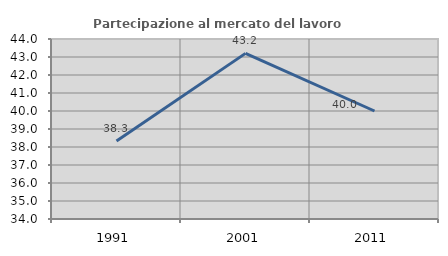
| Category | Partecipazione al mercato del lavoro  femminile |
|---|---|
| 1991.0 | 38.33 |
| 2001.0 | 43.202 |
| 2011.0 | 40 |